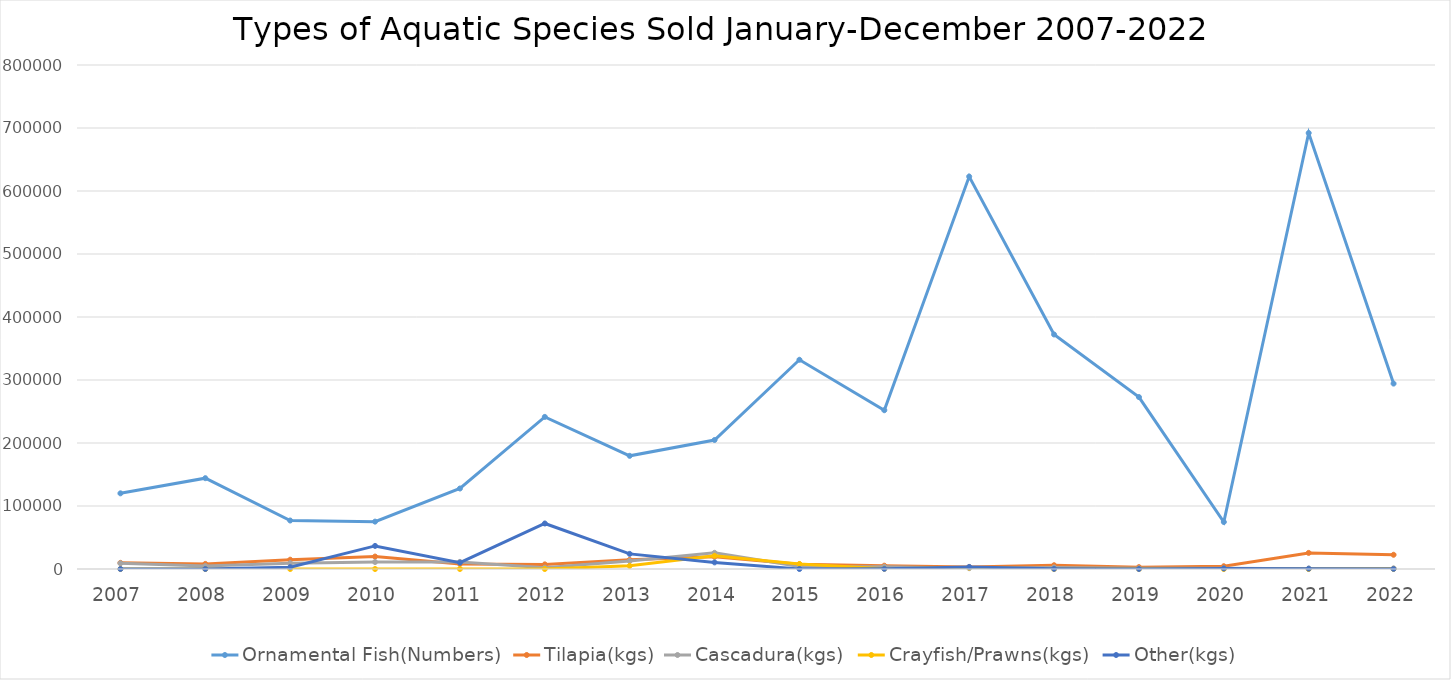
| Category | Ornamental Fish(Numbers)  | Tilapia(kgs) | Cascadura(kgs)  | Crayfish/Prawns(kgs)  | Other(kgs) |
|---|---|---|---|---|---|
| 2007.0 | 120100 | 9768 | 9030 | 0 | 0 |
| 2008.0 | 144150 | 8093 | 4611 | 0 | 30 |
| 2009.0 | 76963 | 14752 | 9195 | 0 | 2909 |
| 2010.0 | 75183 | 19743 | 11100 | 0 | 36645 |
| 2011.0 | 127760 | 8075 | 11295 | 0 | 10045 |
| 2012.0 | 241440 | 7340 | 2125 | 0 | 72250 |
| 2013.0 | 179650 | 14575 | 12700 | 5000 | 24000 |
| 2014.0 | 204750 | 19550 | 25690 | 21000 | 10500 |
| 2015.0 | 332100 | 7515 | 3840 | 8000 | 0 |
| 2016.0 | 252030 | 5275 | 3470 | 440 | 260 |
| 2017.0 | 622950 | 3068 | 1327 | 2273 | 3318 |
| 2018.0 | 372275 | 5959 | 2427 | 0 | 245 |
| 2019.0 | 272900 | 2976 | 1009 | 0 | 45 |
| 2020.0 | 74600 | 4400 | 1021 | 0 | 907 |
| 2021.0 | 692050 | 25564 | 511 | 0 | 581 |
| 2022.0 | 294300 | 22582 | 850 | 181 | 193 |